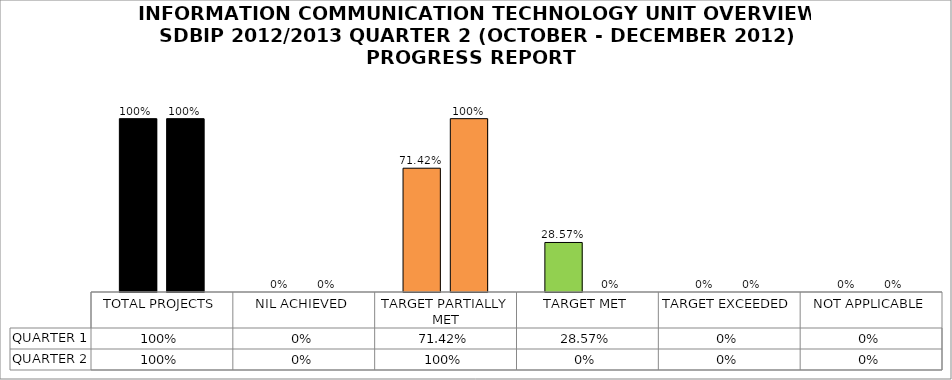
| Category | QUARTER 1 | QUARTER 2 |
|---|---|---|
| TOTAL PROJECTS | 1 | 1 |
| NIL ACHIEVED | 0 | 0 |
| TARGET PARTIALLY MET | 0.714 | 1 |
| TARGET MET | 0.286 | 0 |
| TARGET EXCEEDED | 0 | 0 |
| NOT APPLICABLE | 0 | 0 |